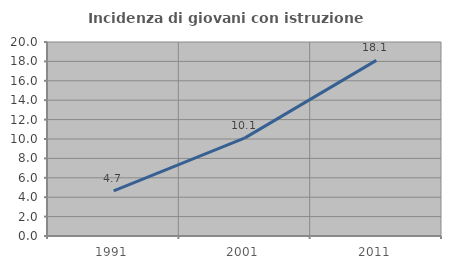
| Category | Incidenza di giovani con istruzione universitaria |
|---|---|
| 1991.0 | 4.656 |
| 2001.0 | 10.114 |
| 2011.0 | 18.107 |